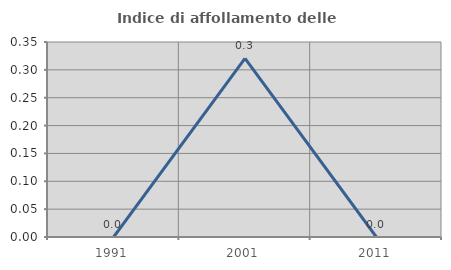
| Category | Indice di affollamento delle abitazioni  |
|---|---|
| 1991.0 | 0 |
| 2001.0 | 0.321 |
| 2011.0 | 0 |